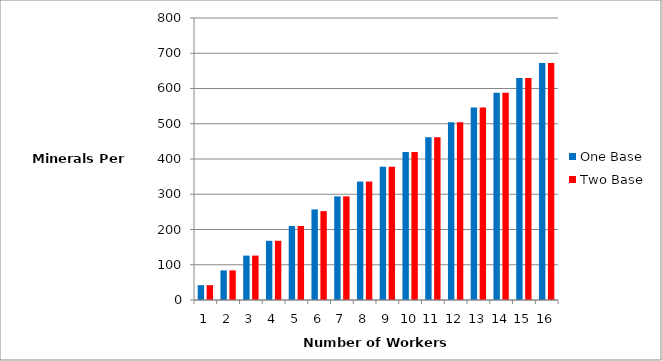
| Category | One Base | Two Base |
|---|---|---|
| 0 | 42 | 42 |
| 1 | 84 | 84 |
| 2 | 126 | 126 |
| 3 | 168 | 168 |
| 4 | 210 | 210 |
| 5 | 257 | 252 |
| 6 | 294 | 294 |
| 7 | 336 | 336 |
| 8 | 378 | 378 |
| 9 | 420 | 420 |
| 10 | 462 | 462 |
| 11 | 504 | 504 |
| 12 | 546 | 546 |
| 13 | 588 | 588 |
| 14 | 630 | 630 |
| 15 | 672 | 672 |